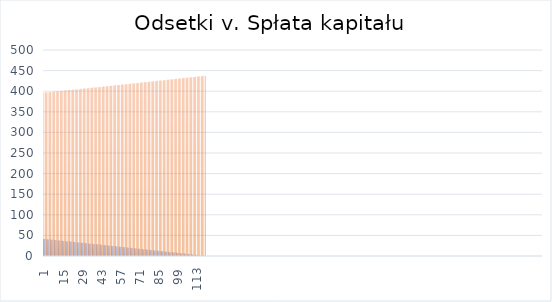
| Category | odsteki miesięczne | kwota spłaty kredytu |
|---|---|---|
| 1 | 41.667 | 396.354 |
| 2 | 41.336 | 396.684 |
| 3 | 41.006 | 397.015 |
| 4 | 40.675 | 397.346 |
| 5 | 40.344 | 397.677 |
| 6 | 40.012 | 398.008 |
| 7 | 39.681 | 398.34 |
| 8 | 39.349 | 398.672 |
| 9 | 39.017 | 399.004 |
| 10 | 38.684 | 399.337 |
| 11 | 38.351 | 399.669 |
| 12 | 38.018 | 400.002 |
| 13 | 37.685 | 400.336 |
| 14 | 37.351 | 400.669 |
| 15 | 37.017 | 401.003 |
| 16 | 36.683 | 401.337 |
| 17 | 36.349 | 401.672 |
| 18 | 36.014 | 402.007 |
| 19 | 35.679 | 402.342 |
| 20 | 35.344 | 402.677 |
| 21 | 35.008 | 403.012 |
| 22 | 34.672 | 403.348 |
| 23 | 34.336 | 403.684 |
| 24 | 34 | 404.021 |
| 25 | 33.663 | 404.357 |
| 26 | 33.326 | 404.694 |
| 27 | 32.989 | 405.032 |
| 28 | 32.651 | 405.369 |
| 29 | 32.314 | 405.707 |
| 30 | 31.976 | 406.045 |
| 31 | 31.637 | 406.383 |
| 32 | 31.298 | 406.722 |
| 33 | 30.96 | 407.061 |
| 34 | 30.62 | 407.4 |
| 35 | 30.281 | 407.74 |
| 36 | 29.941 | 408.08 |
| 37 | 29.601 | 408.42 |
| 38 | 29.261 | 408.76 |
| 39 | 28.92 | 409.101 |
| 40 | 28.579 | 409.442 |
| 41 | 28.238 | 409.783 |
| 42 | 27.896 | 410.124 |
| 43 | 27.555 | 410.466 |
| 44 | 27.213 | 410.808 |
| 45 | 26.87 | 411.15 |
| 46 | 26.528 | 411.493 |
| 47 | 26.185 | 411.836 |
| 48 | 25.842 | 412.179 |
| 49 | 25.498 | 412.523 |
| 50 | 25.154 | 412.866 |
| 51 | 24.81 | 413.21 |
| 52 | 24.466 | 413.555 |
| 53 | 24.121 | 413.899 |
| 54 | 23.776 | 414.244 |
| 55 | 23.431 | 414.589 |
| 56 | 23.086 | 414.935 |
| 57 | 22.74 | 415.281 |
| 58 | 22.394 | 415.627 |
| 59 | 22.047 | 415.973 |
| 60 | 21.701 | 416.32 |
| 61 | 21.354 | 416.667 |
| 62 | 21.007 | 417.014 |
| 63 | 20.659 | 417.361 |
| 64 | 20.311 | 417.709 |
| 65 | 19.963 | 418.057 |
| 66 | 19.615 | 418.406 |
| 67 | 19.266 | 418.754 |
| 68 | 18.917 | 419.103 |
| 69 | 18.568 | 419.453 |
| 70 | 18.218 | 419.802 |
| 71 | 17.869 | 420.152 |
| 72 | 17.518 | 420.502 |
| 73 | 17.168 | 420.853 |
| 74 | 16.817 | 421.203 |
| 75 | 16.466 | 421.554 |
| 76 | 16.115 | 421.906 |
| 77 | 15.763 | 422.257 |
| 78 | 15.412 | 422.609 |
| 79 | 15.059 | 422.961 |
| 80 | 14.707 | 423.314 |
| 81 | 14.354 | 423.666 |
| 82 | 14.001 | 424.02 |
| 83 | 13.648 | 424.373 |
| 84 | 13.294 | 424.727 |
| 85 | 12.94 | 425.08 |
| 86 | 12.586 | 425.435 |
| 87 | 12.231 | 425.789 |
| 88 | 11.877 | 426.144 |
| 89 | 11.521 | 426.499 |
| 90 | 11.166 | 426.855 |
| 91 | 10.81 | 427.21 |
| 92 | 10.454 | 427.566 |
| 93 | 10.098 | 427.923 |
| 94 | 9.741 | 428.279 |
| 95 | 9.385 | 428.636 |
| 96 | 9.027 | 428.993 |
| 97 | 8.67 | 429.351 |
| 98 | 8.312 | 429.709 |
| 99 | 7.954 | 430.067 |
| 100 | 7.596 | 430.425 |
| 101 | 7.237 | 430.784 |
| 102 | 6.878 | 431.143 |
| 103 | 6.519 | 431.502 |
| 104 | 6.159 | 431.862 |
| 105 | 5.799 | 432.221 |
| 106 | 5.439 | 432.582 |
| 107 | 5.078 | 432.942 |
| 108 | 4.718 | 433.303 |
| 109 | 4.357 | 433.664 |
| 110 | 3.995 | 434.025 |
| 111 | 3.633 | 434.387 |
| 112 | 3.272 | 434.749 |
| 113 | 2.909 | 435.111 |
| 114 | 2.547 | 435.474 |
| 115 | 2.184 | 435.837 |
| 116 | 1.821 | 436.2 |
| 117 | 1.457 | 436.564 |
| 118 | 1.093 | 436.927 |
| 119 | 0.729 | 437.291 |
| 120 | 0.365 | 437.656 |